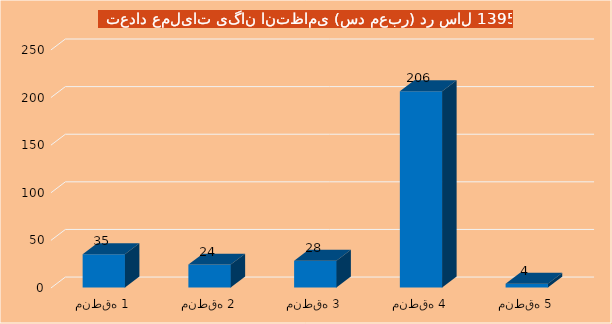
| Category | Series 0 |
|---|---|
| منطقه 1 | 35 |
| منطقه 2 | 24 |
| منطقه 3 | 28 |
| منطقه 4 | 206 |
| منطقه 5 | 4 |